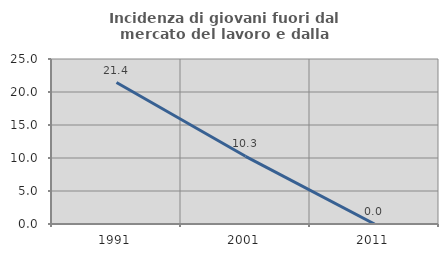
| Category | Incidenza di giovani fuori dal mercato del lavoro e dalla formazione  |
|---|---|
| 1991.0 | 21.429 |
| 2001.0 | 10.256 |
| 2011.0 | 0 |